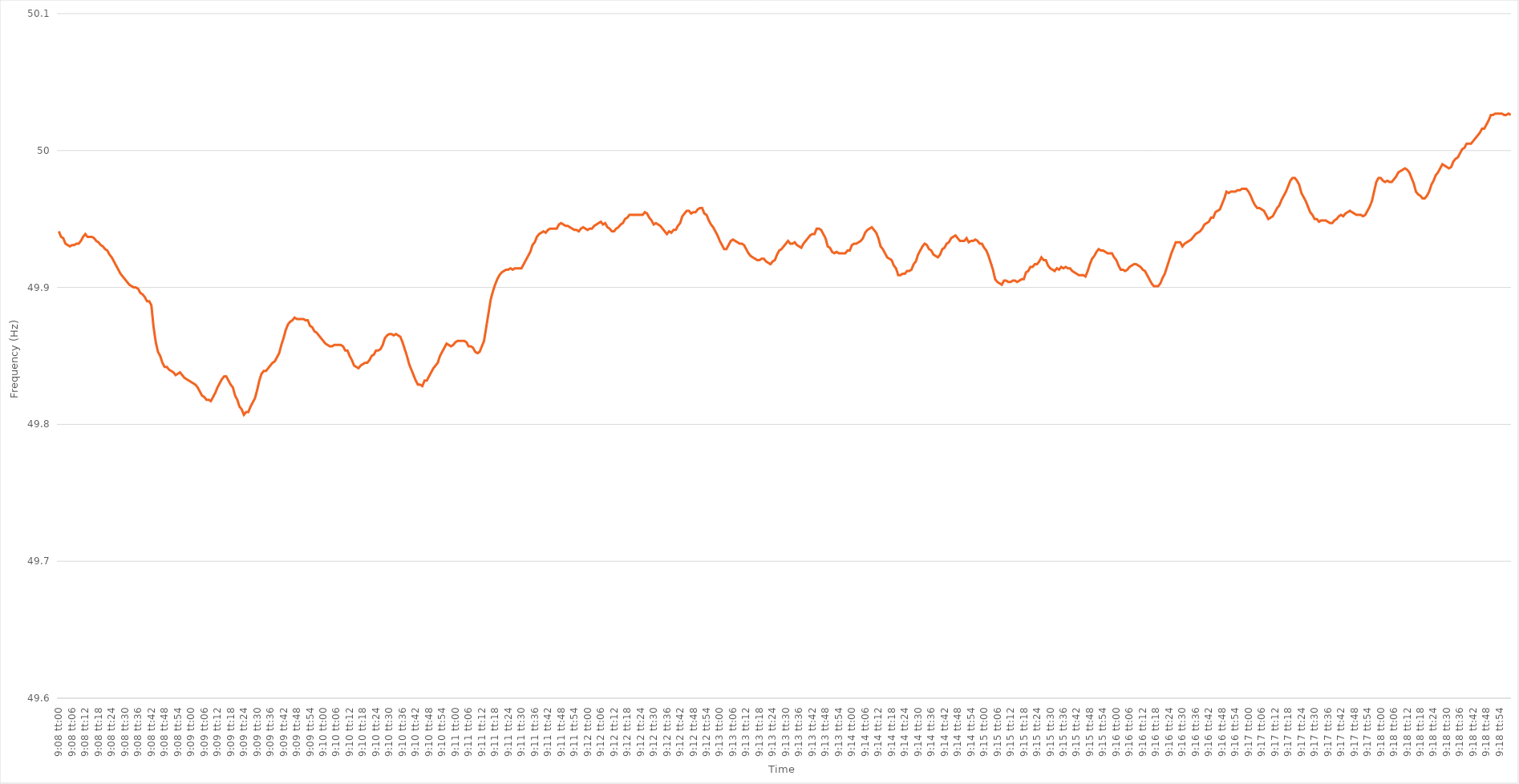
| Category | Series 0 |
|---|---|
| 0.38055555555555554 | 49.941 |
| 0.38056712962962963 | 49.937 |
| 0.38057870370370367 | 49.936 |
| 0.3805902777777778 | 49.932 |
| 0.38060185185185186 | 49.931 |
| 0.38061342592592595 | 49.93 |
| 0.380625 | 49.931 |
| 0.3806365740740741 | 49.931 |
| 0.3806481481481481 | 49.932 |
| 0.3806597222222223 | 49.932 |
| 0.3806712962962963 | 49.934 |
| 0.38068287037037035 | 49.937 |
| 0.38069444444444445 | 49.939 |
| 0.3807060185185185 | 49.937 |
| 0.3807175925925926 | 49.937 |
| 0.3807291666666666 | 49.937 |
| 0.38074074074074077 | 49.936 |
| 0.3807523148148148 | 49.934 |
| 0.3807638888888889 | 49.933 |
| 0.38077546296296294 | 49.931 |
| 0.38078703703703703 | 49.93 |
| 0.3807986111111111 | 49.928 |
| 0.3808101851851852 | 49.927 |
| 0.38082175925925926 | 49.924 |
| 0.38083333333333336 | 49.922 |
| 0.3808449074074074 | 49.919 |
| 0.3808564814814815 | 49.916 |
| 0.38086805555555553 | 49.913 |
| 0.3808796296296297 | 49.91 |
| 0.3808912037037037 | 49.908 |
| 0.3809027777777778 | 49.906 |
| 0.38091435185185185 | 49.904 |
| 0.3809259259259259 | 49.902 |
| 0.3809375 | 49.901 |
| 0.380949074074074 | 49.9 |
| 0.3809606481481482 | 49.9 |
| 0.3809722222222222 | 49.899 |
| 0.3809837962962963 | 49.896 |
| 0.38099537037037035 | 49.895 |
| 0.38100694444444444 | 49.893 |
| 0.3810185185185185 | 49.89 |
| 0.38103009259259263 | 49.89 |
| 0.38104166666666667 | 49.887 |
| 0.38105324074074076 | 49.871 |
| 0.3810648148148148 | 49.86 |
| 0.3810763888888889 | 49.853 |
| 0.38108796296296293 | 49.85 |
| 0.3810995370370371 | 49.845 |
| 0.3811111111111111 | 49.842 |
| 0.3811226851851852 | 49.842 |
| 0.38113425925925926 | 49.84 |
| 0.38114583333333335 | 49.839 |
| 0.3811574074074074 | 49.838 |
| 0.38116898148148143 | 49.836 |
| 0.3811805555555556 | 49.837 |
| 0.3811921296296296 | 49.838 |
| 0.3812037037037037 | 49.836 |
| 0.38121527777777775 | 49.834 |
| 0.38122685185185184 | 49.833 |
| 0.3812384259259259 | 49.832 |
| 0.38125000000000003 | 49.831 |
| 0.38126157407407407 | 49.83 |
| 0.38127314814814817 | 49.829 |
| 0.3812847222222222 | 49.827 |
| 0.3812962962962963 | 49.824 |
| 0.38130787037037034 | 49.821 |
| 0.3813194444444445 | 49.82 |
| 0.3813310185185185 | 49.818 |
| 0.3813425925925926 | 49.818 |
| 0.38135416666666666 | 49.817 |
| 0.38136574074074076 | 49.82 |
| 0.3813773148148148 | 49.823 |
| 0.38138888888888883 | 49.827 |
| 0.381400462962963 | 49.83 |
| 0.381412037037037 | 49.833 |
| 0.3814236111111111 | 49.835 |
| 0.38143518518518515 | 49.835 |
| 0.38144675925925925 | 49.832 |
| 0.3814583333333333 | 49.829 |
| 0.38146990740740744 | 49.827 |
| 0.3814814814814815 | 49.821 |
| 0.38149305555555557 | 49.818 |
| 0.3815046296296296 | 49.813 |
| 0.3815162037037037 | 49.811 |
| 0.38152777777777774 | 49.807 |
| 0.3815393518518519 | 49.809 |
| 0.38155092592592593 | 49.809 |
| 0.3815625 | 49.813 |
| 0.38157407407407407 | 49.816 |
| 0.38158564814814816 | 49.819 |
| 0.3815972222222222 | 49.825 |
| 0.38160879629629635 | 49.832 |
| 0.3816203703703704 | 49.837 |
| 0.3816319444444445 | 49.839 |
| 0.3816435185185185 | 49.839 |
| 0.38165509259259256 | 49.841 |
| 0.38166666666666665 | 49.843 |
| 0.3816782407407407 | 49.845 |
| 0.38168981481481484 | 49.846 |
| 0.3817013888888889 | 49.849 |
| 0.381712962962963 | 49.852 |
| 0.381724537037037 | 49.858 |
| 0.3817361111111111 | 49.863 |
| 0.38174768518518515 | 49.869 |
| 0.3817592592592593 | 49.873 |
| 0.38177083333333334 | 49.875 |
| 0.38178240740740743 | 49.876 |
| 0.38179398148148147 | 49.878 |
| 0.38180555555555556 | 49.877 |
| 0.3818171296296296 | 49.877 |
| 0.38182870370370375 | 49.877 |
| 0.3818402777777778 | 49.877 |
| 0.3818518518518519 | 49.876 |
| 0.3818634259259259 | 49.876 |
| 0.38187499999999996 | 49.872 |
| 0.38188657407407406 | 49.871 |
| 0.3818981481481481 | 49.868 |
| 0.38190972222222225 | 49.867 |
| 0.3819212962962963 | 49.865 |
| 0.3819328703703704 | 49.863 |
| 0.3819444444444444 | 49.861 |
| 0.3819560185185185 | 49.859 |
| 0.38196759259259255 | 49.858 |
| 0.3819791666666667 | 49.857 |
| 0.38199074074074074 | 49.857 |
| 0.38200231481481484 | 49.858 |
| 0.3820138888888889 | 49.858 |
| 0.38202546296296297 | 49.858 |
| 0.382037037037037 | 49.858 |
| 0.38204861111111116 | 49.857 |
| 0.3820601851851852 | 49.854 |
| 0.3820717592592593 | 49.854 |
| 0.38208333333333333 | 49.85 |
| 0.3820949074074074 | 49.847 |
| 0.38210648148148146 | 49.843 |
| 0.3821180555555555 | 49.842 |
| 0.38212962962962965 | 49.841 |
| 0.3821412037037037 | 49.843 |
| 0.3821527777777778 | 49.844 |
| 0.3821643518518518 | 49.845 |
| 0.3821759259259259 | 49.845 |
| 0.38218749999999996 | 49.847 |
| 0.3821990740740741 | 49.85 |
| 0.38221064814814815 | 49.851 |
| 0.38222222222222224 | 49.854 |
| 0.3822337962962963 | 49.854 |
| 0.3822453703703704 | 49.855 |
| 0.3822569444444444 | 49.858 |
| 0.38226851851851856 | 49.863 |
| 0.3822800925925926 | 49.865 |
| 0.3822916666666667 | 49.866 |
| 0.38230324074074074 | 49.866 |
| 0.38231481481481483 | 49.865 |
| 0.38232638888888887 | 49.866 |
| 0.382337962962963 | 49.865 |
| 0.38234953703703706 | 49.864 |
| 0.3823611111111111 | 49.86 |
| 0.3823726851851852 | 49.855 |
| 0.38238425925925923 | 49.85 |
| 0.3823958333333333 | 49.844 |
| 0.38240740740740736 | 49.84 |
| 0.3824189814814815 | 49.836 |
| 0.38243055555555555 | 49.832 |
| 0.38244212962962965 | 49.829 |
| 0.3824537037037037 | 49.829 |
| 0.3824652777777778 | 49.828 |
| 0.3824768518518518 | 49.832 |
| 0.38248842592592597 | 49.832 |
| 0.3825 | 49.835 |
| 0.3825115740740741 | 49.838 |
| 0.38252314814814814 | 49.841 |
| 0.38253472222222223 | 49.843 |
| 0.3825462962962963 | 49.845 |
| 0.3825578703703704 | 49.85 |
| 0.38256944444444446 | 49.853 |
| 0.3825810185185185 | 49.856 |
| 0.3825925925925926 | 49.859 |
| 0.38260416666666663 | 49.858 |
| 0.38261574074074073 | 49.857 |
| 0.38262731481481477 | 49.858 |
| 0.3826388888888889 | 49.86 |
| 0.38265046296296296 | 49.861 |
| 0.38266203703703705 | 49.861 |
| 0.3826736111111111 | 49.861 |
| 0.3826851851851852 | 49.861 |
| 0.3826967592592592 | 49.86 |
| 0.3827083333333334 | 49.857 |
| 0.3827199074074074 | 49.857 |
| 0.3827314814814815 | 49.856 |
| 0.38274305555555554 | 49.853 |
| 0.38275462962962964 | 49.852 |
| 0.3827662037037037 | 49.853 |
| 0.38277777777777783 | 49.857 |
| 0.38278935185185187 | 49.861 |
| 0.38280092592592596 | 49.871 |
| 0.3828125 | 49.881 |
| 0.38282407407407404 | 49.891 |
| 0.38283564814814813 | 49.897 |
| 0.38284722222222217 | 49.902 |
| 0.3828587962962963 | 49.906 |
| 0.38287037037037036 | 49.909 |
| 0.38288194444444446 | 49.911 |
| 0.3828935185185185 | 49.912 |
| 0.3829050925925926 | 49.913 |
| 0.3829166666666666 | 49.913 |
| 0.3829282407407408 | 49.914 |
| 0.3829398148148148 | 49.913 |
| 0.3829513888888889 | 49.914 |
| 0.38296296296296295 | 49.914 |
| 0.38297453703703704 | 49.914 |
| 0.3829861111111111 | 49.914 |
| 0.38299768518518523 | 49.917 |
| 0.38300925925925927 | 49.92 |
| 0.38302083333333337 | 49.923 |
| 0.3830324074074074 | 49.926 |
| 0.3830439814814815 | 49.931 |
| 0.38305555555555554 | 49.933 |
| 0.3830671296296296 | 49.937 |
| 0.3830787037037037 | 49.939 |
| 0.38309027777777777 | 49.94 |
| 0.38310185185185186 | 49.941 |
| 0.3831134259259259 | 49.94 |
| 0.383125 | 49.942 |
| 0.38313657407407403 | 49.943 |
| 0.3831481481481482 | 49.943 |
| 0.3831597222222222 | 49.943 |
| 0.3831712962962963 | 49.943 |
| 0.38318287037037035 | 49.946 |
| 0.38319444444444445 | 49.947 |
| 0.3832060185185185 | 49.946 |
| 0.38321759259259264 | 49.945 |
| 0.3832291666666667 | 49.945 |
| 0.38324074074074077 | 49.944 |
| 0.3832523148148148 | 49.943 |
| 0.3832638888888889 | 49.942 |
| 0.38327546296296294 | 49.942 |
| 0.383287037037037 | 49.941 |
| 0.38329861111111113 | 49.943 |
| 0.38331018518518517 | 49.944 |
| 0.38332175925925926 | 49.943 |
| 0.3833333333333333 | 49.942 |
| 0.3833449074074074 | 49.943 |
| 0.38335648148148144 | 49.943 |
| 0.3833680555555556 | 49.945 |
| 0.3833796296296296 | 49.946 |
| 0.3833912037037037 | 49.947 |
| 0.38340277777777776 | 49.948 |
| 0.38341435185185185 | 49.946 |
| 0.3834259259259259 | 49.947 |
| 0.38343750000000004 | 49.944 |
| 0.3834490740740741 | 49.943 |
| 0.3834606481481482 | 49.941 |
| 0.3834722222222222 | 49.941 |
| 0.3834837962962963 | 49.943 |
| 0.38349537037037035 | 49.944 |
| 0.3835069444444445 | 49.946 |
| 0.38351851851851854 | 49.947 |
| 0.3835300925925926 | 49.95 |
| 0.38354166666666667 | 49.951 |
| 0.3835532407407407 | 49.953 |
| 0.3835648148148148 | 49.953 |
| 0.38357638888888884 | 49.953 |
| 0.383587962962963 | 49.953 |
| 0.38359953703703703 | 49.953 |
| 0.3836111111111111 | 49.953 |
| 0.38362268518518516 | 49.953 |
| 0.38363425925925926 | 49.955 |
| 0.3836458333333333 | 49.954 |
| 0.38365740740740745 | 49.951 |
| 0.3836689814814815 | 49.949 |
| 0.3836805555555556 | 49.946 |
| 0.3836921296296296 | 49.947 |
| 0.3837037037037037 | 49.946 |
| 0.38371527777777775 | 49.945 |
| 0.3837268518518519 | 49.943 |
| 0.38373842592592594 | 49.941 |
| 0.38375000000000004 | 49.939 |
| 0.3837615740740741 | 49.941 |
| 0.3837731481481481 | 49.94 |
| 0.3837847222222222 | 49.942 |
| 0.38379629629629625 | 49.942 |
| 0.3838078703703704 | 49.945 |
| 0.38381944444444444 | 49.947 |
| 0.38383101851851853 | 49.952 |
| 0.38384259259259257 | 49.954 |
| 0.38385416666666666 | 49.956 |
| 0.3838657407407407 | 49.956 |
| 0.38387731481481485 | 49.954 |
| 0.3838888888888889 | 49.955 |
| 0.383900462962963 | 49.955 |
| 0.383912037037037 | 49.957 |
| 0.3839236111111111 | 49.958 |
| 0.38393518518518516 | 49.958 |
| 0.3839467592592593 | 49.954 |
| 0.38395833333333335 | 49.953 |
| 0.38396990740740744 | 49.949 |
| 0.3839814814814815 | 49.946 |
| 0.3839930555555555 | 49.944 |
| 0.3840046296296296 | 49.941 |
| 0.38401620370370365 | 49.938 |
| 0.3840277777777778 | 49.934 |
| 0.38403935185185184 | 49.931 |
| 0.38405092592592593 | 49.928 |
| 0.3840625 | 49.928 |
| 0.38407407407407407 | 49.931 |
| 0.3840856481481481 | 49.934 |
| 0.38409722222222226 | 49.935 |
| 0.3841087962962963 | 49.934 |
| 0.3841203703703704 | 49.933 |
| 0.38413194444444443 | 49.932 |
| 0.3841435185185185 | 49.932 |
| 0.38415509259259256 | 49.931 |
| 0.3841666666666667 | 49.928 |
| 0.38417824074074075 | 49.925 |
| 0.38418981481481485 | 49.923 |
| 0.3842013888888889 | 49.922 |
| 0.384212962962963 | 49.921 |
| 0.384224537037037 | 49.92 |
| 0.38423611111111117 | 49.92 |
| 0.3842476851851852 | 49.921 |
| 0.38425925925925924 | 49.921 |
| 0.38427083333333334 | 49.919 |
| 0.3842824074074074 | 49.918 |
| 0.3842939814814815 | 49.917 |
| 0.3843055555555555 | 49.919 |
| 0.38431712962962966 | 49.92 |
| 0.3843287037037037 | 49.924 |
| 0.3843402777777778 | 49.927 |
| 0.38435185185185183 | 49.928 |
| 0.38436342592592593 | 49.93 |
| 0.38437499999999997 | 49.932 |
| 0.3843865740740741 | 49.934 |
| 0.38439814814814816 | 49.932 |
| 0.38440972222222225 | 49.932 |
| 0.3844212962962963 | 49.933 |
| 0.3844328703703704 | 49.931 |
| 0.3844444444444444 | 49.93 |
| 0.38445601851851857 | 49.929 |
| 0.3844675925925926 | 49.932 |
| 0.38447916666666665 | 49.934 |
| 0.38449074074074074 | 49.936 |
| 0.3845023148148148 | 49.938 |
| 0.3845138888888889 | 49.939 |
| 0.3845254629629629 | 49.939 |
| 0.38453703703703707 | 49.943 |
| 0.3845486111111111 | 49.943 |
| 0.3845601851851852 | 49.942 |
| 0.38457175925925924 | 49.939 |
| 0.38458333333333333 | 49.936 |
| 0.38459490740740737 | 49.93 |
| 0.3846064814814815 | 49.929 |
| 0.38461805555555556 | 49.926 |
| 0.38462962962962965 | 49.925 |
| 0.3846412037037037 | 49.926 |
| 0.3846527777777778 | 49.925 |
| 0.3846643518518518 | 49.925 |
| 0.384675925925926 | 49.925 |
| 0.3846875 | 49.925 |
| 0.3846990740740741 | 49.927 |
| 0.38471064814814815 | 49.927 |
| 0.3847222222222222 | 49.931 |
| 0.3847337962962963 | 49.932 |
| 0.3847453703703703 | 49.932 |
| 0.38475694444444447 | 49.933 |
| 0.3847685185185185 | 49.934 |
| 0.3847800925925926 | 49.936 |
| 0.38479166666666664 | 49.94 |
| 0.38480324074074074 | 49.942 |
| 0.3848148148148148 | 49.943 |
| 0.3848263888888889 | 49.944 |
| 0.38483796296296297 | 49.942 |
| 0.38484953703703706 | 49.94 |
| 0.3848611111111111 | 49.936 |
| 0.3848726851851852 | 49.93 |
| 0.38488425925925923 | 49.928 |
| 0.3848958333333334 | 49.925 |
| 0.3849074074074074 | 49.922 |
| 0.3849189814814815 | 49.921 |
| 0.38493055555555555 | 49.92 |
| 0.38494212962962965 | 49.916 |
| 0.3849537037037037 | 49.914 |
| 0.3849652777777777 | 49.909 |
| 0.3849768518518519 | 49.909 |
| 0.3849884259259259 | 49.91 |
| 0.385 | 49.91 |
| 0.38501157407407405 | 49.912 |
| 0.38502314814814814 | 49.912 |
| 0.3850347222222222 | 49.913 |
| 0.38504629629629633 | 49.917 |
| 0.38505787037037037 | 49.919 |
| 0.38506944444444446 | 49.924 |
| 0.3850810185185185 | 49.927 |
| 0.3850925925925926 | 49.93 |
| 0.38510416666666664 | 49.932 |
| 0.3851157407407408 | 49.931 |
| 0.3851273148148148 | 49.928 |
| 0.3851388888888889 | 49.927 |
| 0.38515046296296296 | 49.924 |
| 0.38516203703703705 | 49.923 |
| 0.3851736111111111 | 49.922 |
| 0.38518518518518513 | 49.924 |
| 0.3851967592592593 | 49.928 |
| 0.3852083333333333 | 49.929 |
| 0.3852199074074074 | 49.932 |
| 0.38523148148148145 | 49.933 |
| 0.38524305555555555 | 49.936 |
| 0.3852546296296296 | 49.937 |
| 0.38526620370370374 | 49.938 |
| 0.3852777777777778 | 49.936 |
| 0.38528935185185187 | 49.934 |
| 0.3853009259259259 | 49.934 |
| 0.3853125 | 49.934 |
| 0.38532407407407404 | 49.936 |
| 0.3853356481481482 | 49.933 |
| 0.38534722222222223 | 49.934 |
| 0.3853587962962963 | 49.934 |
| 0.38537037037037036 | 49.935 |
| 0.38538194444444446 | 49.934 |
| 0.3853935185185185 | 49.932 |
| 0.38540509259259265 | 49.932 |
| 0.3854166666666667 | 49.929 |
| 0.3854282407407407 | 49.927 |
| 0.3854398148148148 | 49.923 |
| 0.38545138888888886 | 49.918 |
| 0.38546296296296295 | 49.913 |
| 0.385474537037037 | 49.906 |
| 0.38548611111111114 | 49.904 |
| 0.3854976851851852 | 49.903 |
| 0.3855092592592593 | 49.902 |
| 0.3855208333333333 | 49.905 |
| 0.3855324074074074 | 49.905 |
| 0.38554398148148145 | 49.904 |
| 0.3855555555555556 | 49.904 |
| 0.38556712962962963 | 49.905 |
| 0.38557870370370373 | 49.905 |
| 0.38559027777777777 | 49.904 |
| 0.38560185185185186 | 49.905 |
| 0.3856134259259259 | 49.906 |
| 0.38562500000000005 | 49.906 |
| 0.3856365740740741 | 49.911 |
| 0.3856481481481482 | 49.912 |
| 0.3856597222222222 | 49.915 |
| 0.38567129629629626 | 49.915 |
| 0.38568287037037036 | 49.917 |
| 0.3856944444444444 | 49.917 |
| 0.38570601851851855 | 49.919 |
| 0.3857175925925926 | 49.922 |
| 0.3857291666666667 | 49.92 |
| 0.3857407407407407 | 49.92 |
| 0.3857523148148148 | 49.916 |
| 0.38576388888888885 | 49.914 |
| 0.385775462962963 | 49.913 |
| 0.38578703703703704 | 49.912 |
| 0.38579861111111113 | 49.914 |
| 0.3858101851851852 | 49.913 |
| 0.38582175925925927 | 49.915 |
| 0.3858333333333333 | 49.914 |
| 0.38584490740740746 | 49.915 |
| 0.3858564814814815 | 49.914 |
| 0.3858680555555556 | 49.914 |
| 0.38587962962962963 | 49.912 |
| 0.38589120370370367 | 49.911 |
| 0.38590277777777776 | 49.91 |
| 0.3859143518518518 | 49.909 |
| 0.38592592592592595 | 49.909 |
| 0.3859375 | 49.909 |
| 0.3859490740740741 | 49.908 |
| 0.3859606481481481 | 49.912 |
| 0.3859722222222222 | 49.917 |
| 0.38598379629629626 | 49.921 |
| 0.3859953703703704 | 49.923 |
| 0.38600694444444444 | 49.926 |
| 0.38601851851851854 | 49.928 |
| 0.3860300925925926 | 49.927 |
| 0.38604166666666667 | 49.927 |
| 0.3860532407407407 | 49.926 |
| 0.38606481481481486 | 49.925 |
| 0.3860763888888889 | 49.925 |
| 0.386087962962963 | 49.925 |
| 0.38609953703703703 | 49.922 |
| 0.3861111111111111 | 49.92 |
| 0.38612268518518517 | 49.916 |
| 0.3861342592592593 | 49.913 |
| 0.38614583333333335 | 49.913 |
| 0.3861574074074074 | 49.912 |
| 0.3861689814814815 | 49.913 |
| 0.3861805555555555 | 49.915 |
| 0.3861921296296296 | 49.916 |
| 0.38620370370370366 | 49.917 |
| 0.3862152777777778 | 49.917 |
| 0.38622685185185185 | 49.916 |
| 0.38623842592592594 | 49.915 |
| 0.38625 | 49.913 |
| 0.3862615740740741 | 49.912 |
| 0.3862731481481481 | 49.909 |
| 0.38628472222222227 | 49.906 |
| 0.3862962962962963 | 49.903 |
| 0.3863078703703704 | 49.901 |
| 0.38631944444444444 | 49.901 |
| 0.38633101851851853 | 49.901 |
| 0.38634259259259257 | 49.903 |
| 0.3863541666666667 | 49.907 |
| 0.38636574074074076 | 49.91 |
| 0.3863773148148148 | 49.915 |
| 0.3863888888888889 | 49.92 |
| 0.38640046296296293 | 49.925 |
| 0.386412037037037 | 49.929 |
| 0.38642361111111106 | 49.933 |
| 0.3864351851851852 | 49.933 |
| 0.38644675925925925 | 49.933 |
| 0.38645833333333335 | 49.93 |
| 0.3864699074074074 | 49.932 |
| 0.3864814814814815 | 49.933 |
| 0.3864930555555555 | 49.934 |
| 0.38650462962962967 | 49.935 |
| 0.3865162037037037 | 49.937 |
| 0.3865277777777778 | 49.939 |
| 0.38653935185185184 | 49.94 |
| 0.38655092592592594 | 49.941 |
| 0.3865625 | 49.943 |
| 0.3865740740740741 | 49.946 |
| 0.38658564814814816 | 49.947 |
| 0.3865972222222222 | 49.948 |
| 0.3866087962962963 | 49.951 |
| 0.38662037037037034 | 49.951 |
| 0.38663194444444443 | 49.955 |
| 0.38664351851851847 | 49.956 |
| 0.3866550925925926 | 49.957 |
| 0.38666666666666666 | 49.961 |
| 0.38667824074074075 | 49.965 |
| 0.3866898148148148 | 49.97 |
| 0.3867013888888889 | 49.969 |
| 0.3867129629629629 | 49.97 |
| 0.3867245370370371 | 49.97 |
| 0.3867361111111111 | 49.97 |
| 0.3867476851851852 | 49.971 |
| 0.38675925925925925 | 49.971 |
| 0.38677083333333334 | 49.972 |
| 0.3867824074074074 | 49.972 |
| 0.38679398148148153 | 49.972 |
| 0.38680555555555557 | 49.97 |
| 0.38681712962962966 | 49.967 |
| 0.3868287037037037 | 49.963 |
| 0.3868402777777778 | 49.96 |
| 0.38685185185185184 | 49.958 |
| 0.3868634259259259 | 49.958 |
| 0.386875 | 49.957 |
| 0.38688657407407406 | 49.956 |
| 0.38689814814814816 | 49.953 |
| 0.3869097222222222 | 49.95 |
| 0.3869212962962963 | 49.951 |
| 0.38693287037037033 | 49.952 |
| 0.3869444444444445 | 49.955 |
| 0.3869560185185185 | 49.958 |
| 0.3869675925925926 | 49.96 |
| 0.38697916666666665 | 49.964 |
| 0.38699074074074075 | 49.967 |
| 0.3870023148148148 | 49.97 |
| 0.38701388888888894 | 49.974 |
| 0.387025462962963 | 49.978 |
| 0.38703703703703707 | 49.98 |
| 0.3870486111111111 | 49.98 |
| 0.3870601851851852 | 49.978 |
| 0.38707175925925924 | 49.975 |
| 0.3870833333333333 | 49.969 |
| 0.38709490740740743 | 49.966 |
| 0.38710648148148147 | 49.963 |
| 0.38711805555555556 | 49.959 |
| 0.3871296296296296 | 49.955 |
| 0.3871412037037037 | 49.953 |
| 0.38715277777777773 | 49.95 |
| 0.3871643518518519 | 49.95 |
| 0.3871759259259259 | 49.948 |
| 0.3871875 | 49.949 |
| 0.38719907407407406 | 49.949 |
| 0.38721064814814815 | 49.949 |
| 0.3872222222222222 | 49.948 |
| 0.38723379629629634 | 49.947 |
| 0.3872453703703704 | 49.947 |
| 0.3872569444444445 | 49.949 |
| 0.3872685185185185 | 49.95 |
| 0.3872800925925926 | 49.952 |
| 0.38729166666666665 | 49.953 |
| 0.3873032407407407 | 49.952 |
| 0.38731481481481483 | 49.954 |
| 0.3873263888888889 | 49.955 |
| 0.38733796296296297 | 49.956 |
| 0.387349537037037 | 49.955 |
| 0.3873611111111111 | 49.954 |
| 0.38737268518518514 | 49.953 |
| 0.3873842592592593 | 49.953 |
| 0.38739583333333333 | 49.953 |
| 0.3874074074074074 | 49.952 |
| 0.38741898148148146 | 49.953 |
| 0.38743055555555556 | 49.956 |
| 0.3874421296296296 | 49.959 |
| 0.38745370370370374 | 49.963 |
| 0.3874652777777778 | 49.97 |
| 0.3874768518518519 | 49.977 |
| 0.3874884259259259 | 49.98 |
| 0.3875 | 49.98 |
| 0.38751157407407405 | 49.978 |
| 0.3875231481481482 | 49.977 |
| 0.38753472222222224 | 49.978 |
| 0.38754629629629633 | 49.977 |
| 0.38755787037037037 | 49.977 |
| 0.3875694444444444 | 49.979 |
| 0.3875810185185185 | 49.981 |
| 0.38759259259259254 | 49.984 |
| 0.3876041666666667 | 49.985 |
| 0.38761574074074073 | 49.986 |
| 0.3876273148148148 | 49.987 |
| 0.38763888888888887 | 49.986 |
| 0.38765046296296296 | 49.984 |
| 0.387662037037037 | 49.98 |
| 0.38767361111111115 | 49.976 |
| 0.3876851851851852 | 49.97 |
| 0.3876967592592593 | 49.968 |
| 0.3877083333333333 | 49.967 |
| 0.3877199074074074 | 49.965 |
| 0.38773148148148145 | 49.965 |
| 0.3877430555555556 | 49.967 |
| 0.38775462962962964 | 49.97 |
| 0.38776620370370374 | 49.975 |
| 0.3877777777777778 | 49.978 |
| 0.3877893518518518 | 49.982 |
| 0.3878009259259259 | 49.984 |
| 0.38781249999999995 | 49.987 |
| 0.3878240740740741 | 49.99 |
| 0.38783564814814814 | 49.989 |
| 0.38784722222222223 | 49.988 |
| 0.38785879629629627 | 49.987 |
| 0.38787037037037037 | 49.988 |
| 0.3878819444444444 | 49.992 |
| 0.38789351851851855 | 49.994 |
| 0.3879050925925926 | 49.995 |
| 0.3879166666666667 | 49.998 |
| 0.3879282407407407 | 50.001 |
| 0.3879398148148148 | 50.002 |
| 0.38795138888888886 | 50.005 |
| 0.387962962962963 | 50.005 |
| 0.38797453703703705 | 50.005 |
| 0.38798611111111114 | 50.007 |
| 0.3879976851851852 | 50.009 |
| 0.3880092592592593 | 50.011 |
| 0.3880208333333333 | 50.013 |
| 0.38803240740740735 | 50.016 |
| 0.3880439814814815 | 50.016 |
| 0.38805555555555554 | 50.019 |
| 0.38806712962962964 | 50.022 |
| 0.3880787037037037 | 50.026 |
| 0.38809027777777777 | 50.026 |
| 0.3881018518518518 | 50.027 |
| 0.38811342592592596 | 50.027 |
| 0.388125 | 50.027 |
| 0.3881365740740741 | 50.027 |
| 0.38814814814814813 | 50.026 |
| 0.3881597222222222 | 50.026 |
| 0.38817129629629626 | 50.027 |
| 0.3881828703703704 | 50.026 |